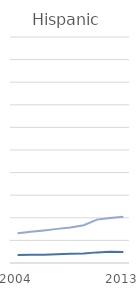
| Category | Hispanic Staff | Hispanic Student |
|---|---|---|
| 2004 | 3.5 | 13.2 |
|  | 3.7 | 13.8 |
|  | 3.7 | 14.4 |
|  | 3.9 | 15.1 |
|  | 4.1 | 15.7 |
|  | 4.2 | 16.7 |
|  | 4.7 | 19.2 |
|  | 5 | 19.9 |
| 2013 | 4.9 | 20.5 |